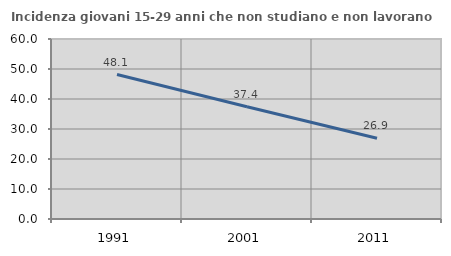
| Category | Incidenza giovani 15-29 anni che non studiano e non lavorano  |
|---|---|
| 1991.0 | 48.148 |
| 2001.0 | 37.409 |
| 2011.0 | 26.891 |